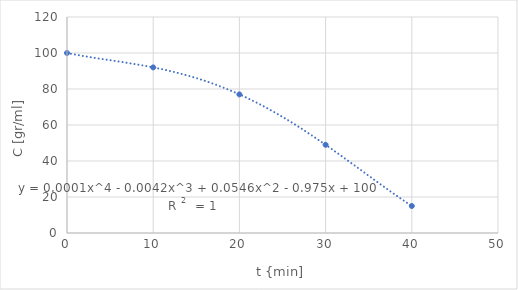
| Category | Series 0 |
|---|---|
| 0.0 | 100 |
| 10.0 | 92 |
| 20.0 | 77 |
| 30.0 | 49 |
| 40.0 | 15 |